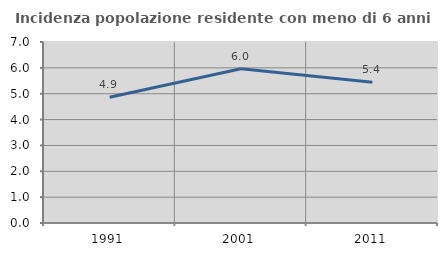
| Category | Incidenza popolazione residente con meno di 6 anni |
|---|---|
| 1991.0 | 4.862 |
| 2001.0 | 5.969 |
| 2011.0 | 5.445 |